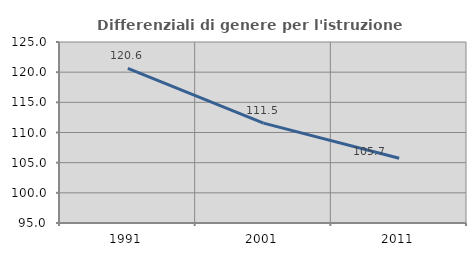
| Category | Differenziali di genere per l'istruzione superiore |
|---|---|
| 1991.0 | 120.622 |
| 2001.0 | 111.549 |
| 2011.0 | 105.741 |